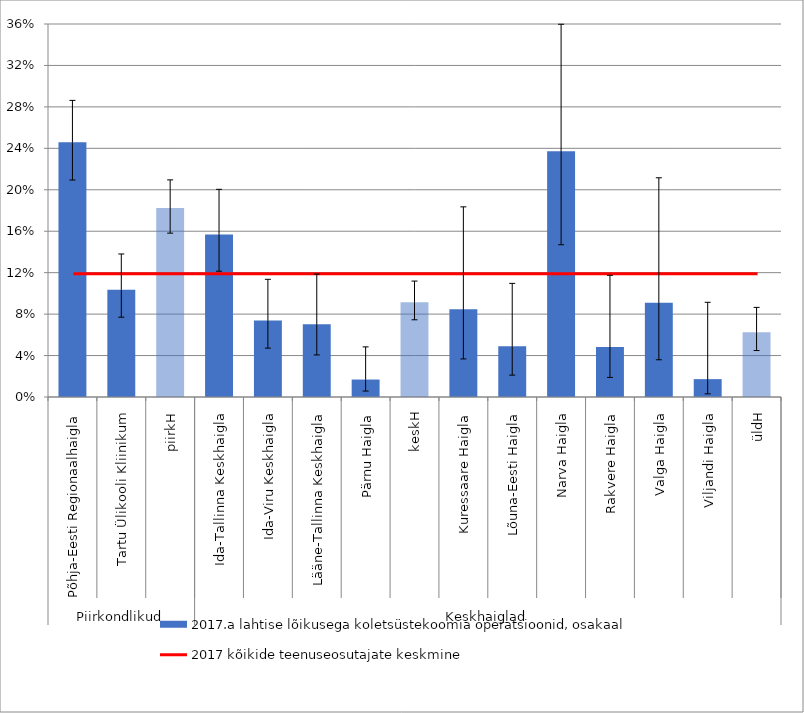
| Category | 2017.a lahtise lõikusega koletsüstekoomia operatsioonid, osakaal |
|---|---|
| 0 | 0.246 |
| 1 | 0.104 |
| 2 | 0.182 |
| 3 | 0.157 |
| 4 | 0.074 |
| 5 | 0.07 |
| 6 | 0.017 |
| 7 | 0.092 |
| 8 | 0.085 |
| 9 | 0.049 |
| 10 | 0.237 |
| 11 | 0.048 |
| 12 | 0.091 |
| 13 | 0.017 |
| 14 | 0.062 |